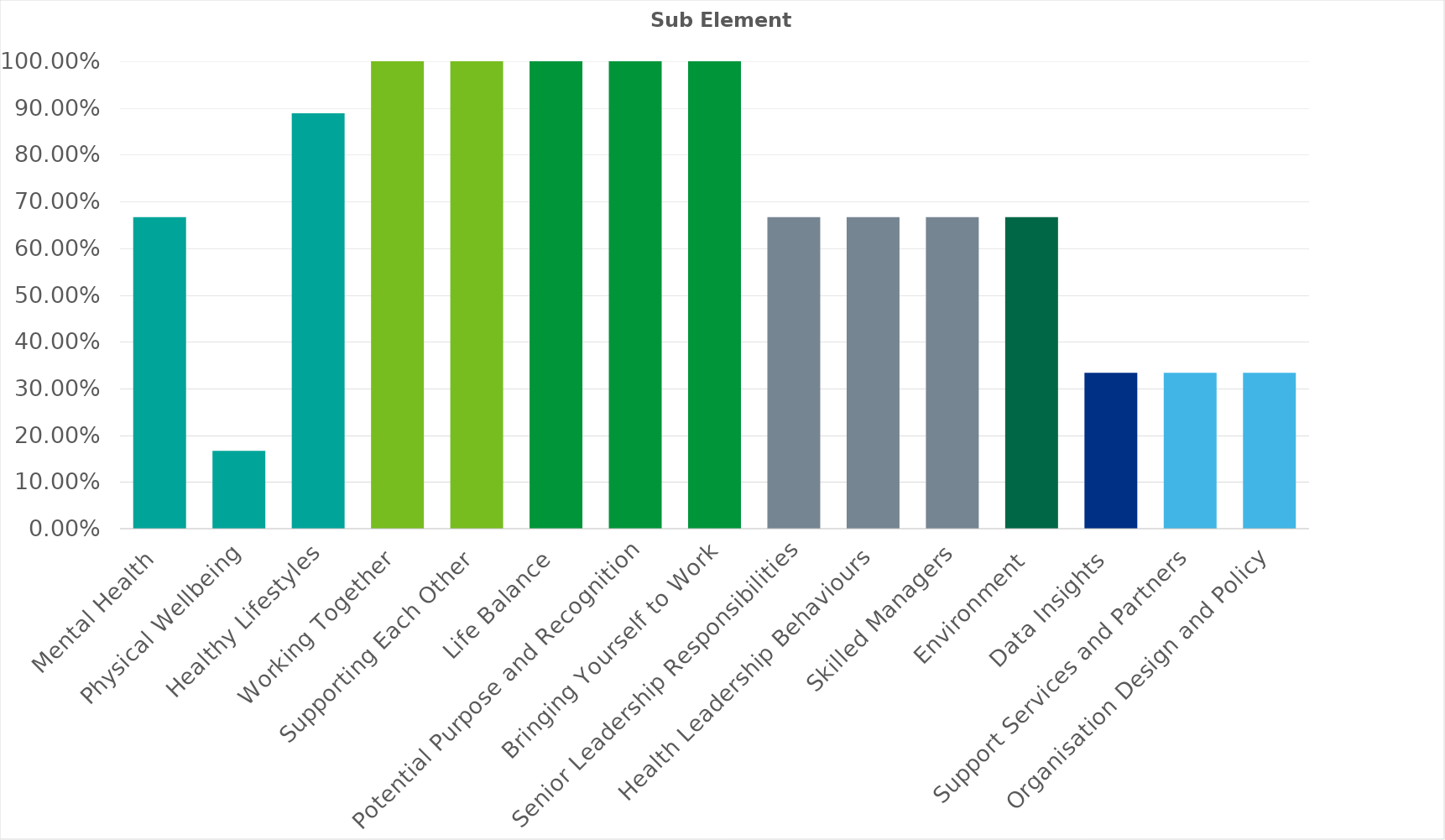
| Category | Series 0 |
|---|---|
| Mental Health | 0.667 |
| Physical Wellbeing | 0.167 |
| Healthy Lifestyles | 0.889 |
| Working Together  | 1 |
| Supporting Each Other | 1 |
| Life Balance | 1 |
| Potential Purpose and Recognition | 1 |
| Bringing Yourself to Work | 1 |
| Senior Leadership Responsibilities | 0.667 |
| Health Leadership Behaviours | 0.667 |
| Skilled Managers | 0.667 |
| Environment | 0.667 |
| Data Insights | 0.333 |
| Support Services and Partners | 0.333 |
| Organisation Design and Policy | 0.333 |